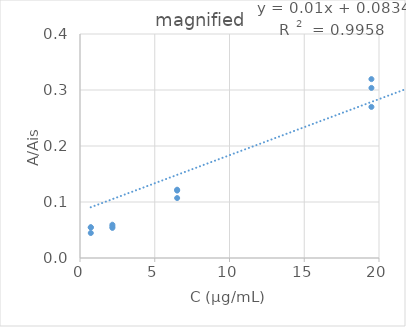
| Category | A/Ais |
|---|---|
| 0.7219708330308661 | 0.055 |
| 0.7219708330308661 | 0.054 |
| 0.7219708330308661 | 0.045 |
| 2.165912499092598 | 0.056 |
| 2.165912499092598 | 0.059 |
| 2.165912499092598 | 0.054 |
| 6.497737497277795 | 0.122 |
| 6.497737497277795 | 0.12 |
| 6.497737497277795 | 0.107 |
| 19.493212491833383 | 0.319 |
| 19.493212491833383 | 0.304 |
| 19.493212491833383 | 0.27 |
| 58.47963747550015 | 0.749 |
| 58.47963747550015 | 0.767 |
| 58.47963747550015 | 0.667 |
| 175.43891242650045 | 2.046 |
| 175.43891242650045 | 1.971 |
| 175.43891242650045 | 1.727 |
| 526.3167372795014 | 5.279 |
| 526.3167372795014 | 5.642 |
| 526.3167372795014 | 5.053 |